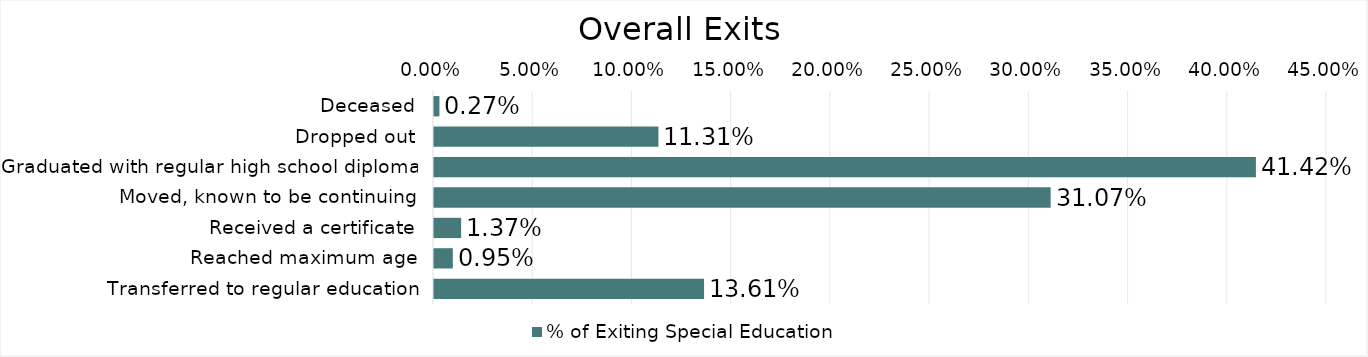
| Category | % of Exiting Special Education |
|---|---|
| Deceased | 0.003 |
| Dropped out | 0.113 |
| Graduated with regular high school diploma | 0.414 |
| Moved, known to be continuing | 0.311 |
| Received a certificate | 0.014 |
| Reached maximum age | 0.009 |
| Transferred to regular education | 0.136 |